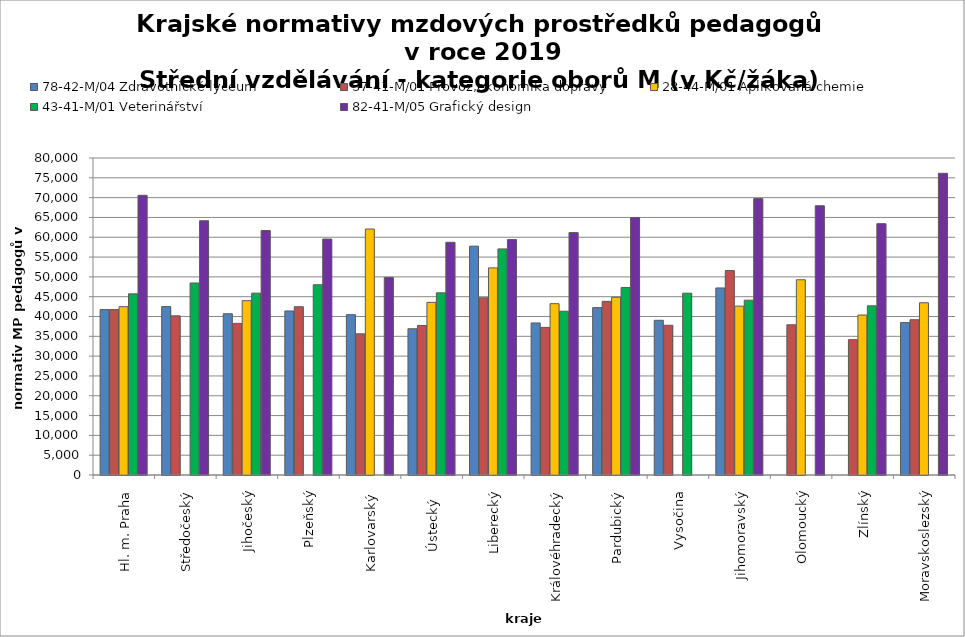
| Category | 78-42-M/04 Zdravotnické lyceum | 37-41-M/01 Provoz,ekonomika dopravy | 28-44-M/01 Aplikovaná chemie | 43-41-M/01 Veterinářství | 82-41-M/05 Grafický design |
|---|---|---|---|---|---|
| Hl. m. Praha | 41739.13 | 41739.13 | 42477.876 | 45714.286 | 70588.235 |
| Středočeský | 42500.334 | 40163.095 | 0 | 48454.806 | 64165.231 |
| Jihočeský | 40692.801 | 38258.305 | 43994.527 | 45894.769 | 61702.033 |
| Plzeňský | 41397.38 | 42473.118 | 0 | 48024.316 | 59547.739 |
| Karlovarský  | 40468.891 | 35619.048 | 62074.689 | 0 | 49866.667 |
| Ústecký   | 36903.061 | 37737.391 | 43572.289 | 45972.458 | 58725.304 |
| Liberecký | 57752.226 | 44715.405 | 52269.609 | 57054.847 | 59415.555 |
| Královéhradecký | 38373.737 | 37251.498 | 43238.346 | 41334.771 | 61177.66 |
| Pardubický | 42247.549 | 43828.791 | 44862.083 | 47326.01 | 64963.869 |
| Vysočina | 39041.705 | 37786.658 | 0 | 45886.704 | 0 |
| Jihomoravský | 47204.38 | 51600.766 | 42617.688 | 44116.243 | 69750.881 |
| Olomoucký | 0 | 37908.699 | 49273.444 | 0 | 67953.648 |
| Zlínský | 0 | 34156.615 | 40366.909 | 42695.769 | 63433.714 |
| Moravskoslezský | 38465.228 | 39185.668 | 43468.835 | 0 | 76139.241 |